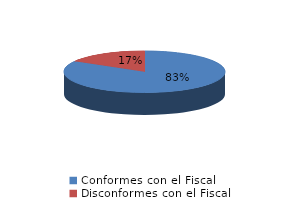
| Category | Series 0 |
|---|---|
| 0 | 1440 |
| 1 | 288 |